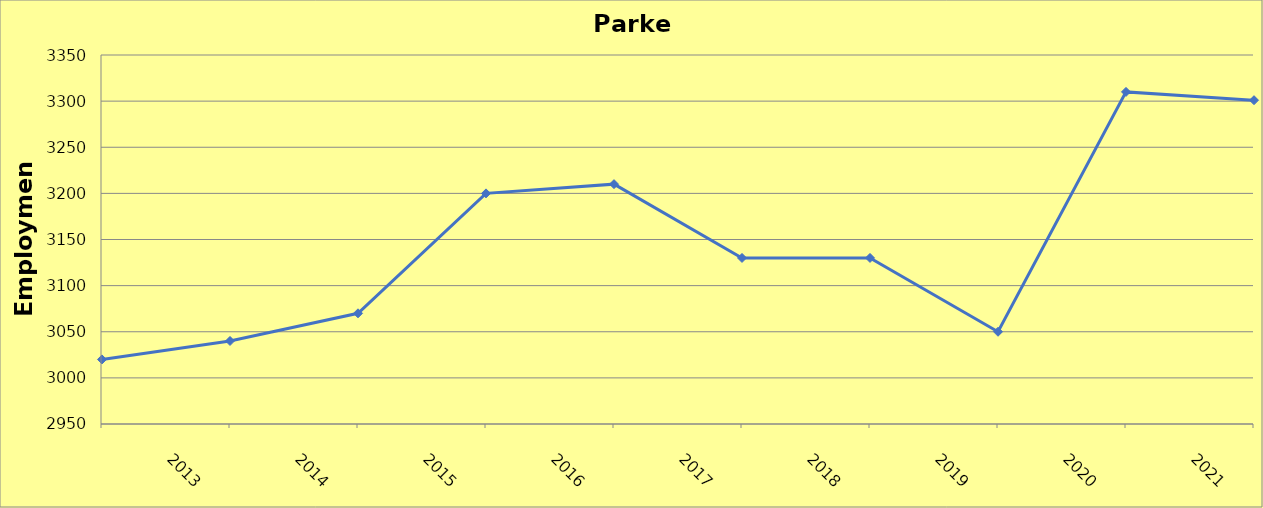
| Category | Parke County |
|---|---|
| 2013.0 | 3020 |
| 2014.0 | 3040 |
| 2015.0 | 3070 |
| 2016.0 | 3200 |
| 2017.0 | 3210 |
| 2018.0 | 3130 |
| 2019.0 | 3130 |
| 2020.0 | 3050 |
| 2021.0 | 3310 |
| 2022.0 | 3301 |